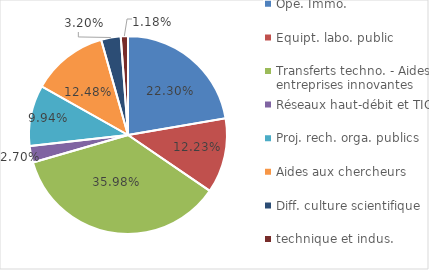
| Category | Part du budget R&T consacrés aux opérations |
|---|---|
| 0 | 0.223 |
| 1 | 0.122 |
| 2 | 0.36 |
| 3 | 0.027 |
| 4 | 0.099 |
| 5 | 0.125 |
| 6 | 0.032 |
| 7 | 0.012 |